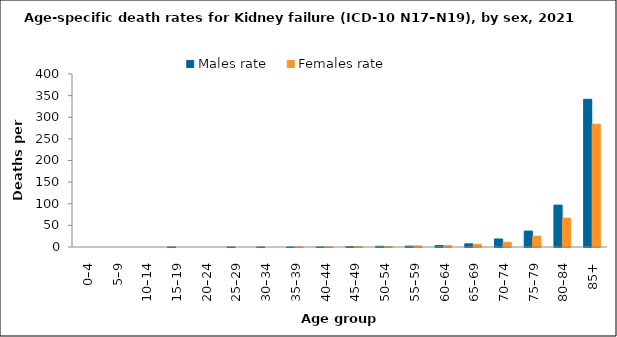
| Category | Males rate | Females rate |
|---|---|---|
| 0–4 | 0 | 0 |
| 5–9 | 0 | 0 |
| 10–14 | 0 | 0 |
| 15–19 | 0.131 | 0 |
| 20–24 | 0 | 0 |
| 25–29 | 0.109 | 0 |
| 30–34 | 0.106 | 0 |
| 35–39 | 0.108 | 0.106 |
| 40–44 | 0.245 | 0.238 |
| 45–49 | 0.734 | 1.081 |
| 50–54 | 1.637 | 1.223 |
| 55–59 | 1.967 | 2.411 |
| 60–64 | 3.375 | 3.051 |
| 65–69 | 7.287 | 6.188 |
| 70–74 | 18.569 | 10.978 |
| 75–79 | 36.871 | 25.039 |
| 80–84 | 96.815 | 66.679 |
| 85+ | 341.447 | 283.921 |